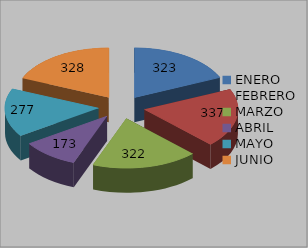
| Category | Series 0 |
|---|---|
| ENERO | 323 |
| FEBRERO | 337 |
| MARZO | 322 |
| ABRIL | 173 |
| MAYO | 277 |
| JUNIO | 328 |